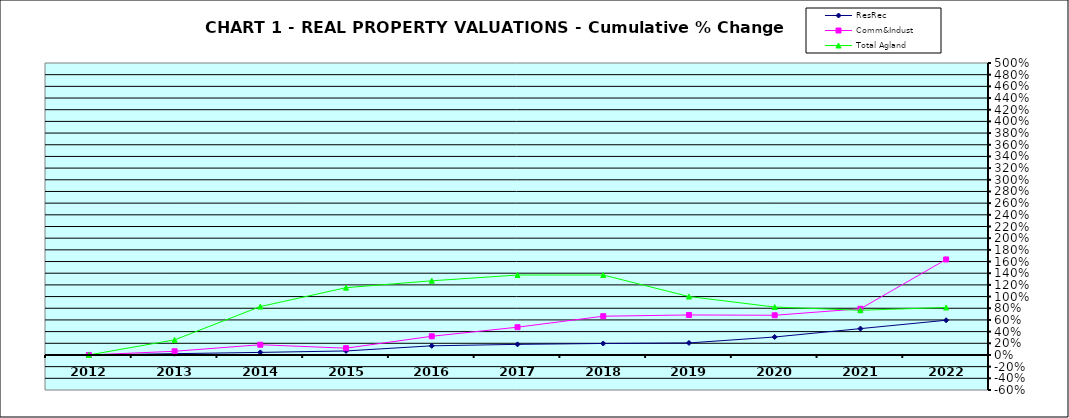
| Category | ResRec | Comm&Indust | Total Agland |
|---|---|---|---|
| 2012.0 | 0 | 0 | 0 |
| 2013.0 | 0.022 | 0.063 | 0.259 |
| 2014.0 | 0.044 | 0.175 | 0.829 |
| 2015.0 | 0.069 | 0.116 | 1.152 |
| 2016.0 | 0.157 | 0.32 | 1.27 |
| 2017.0 | 0.182 | 0.476 | 1.369 |
| 2018.0 | 0.197 | 0.664 | 1.369 |
| 2019.0 | 0.206 | 0.685 | 1.001 |
| 2020.0 | 0.308 | 0.68 | 0.821 |
| 2021.0 | 0.451 | 0.791 | 0.766 |
| 2022.0 | 0.594 | 1.636 | 0.814 |